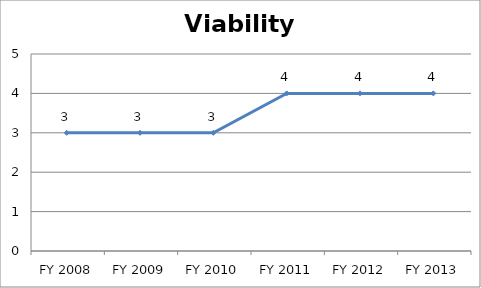
| Category | Viability score |
|---|---|
| FY 2013 | 4 |
| FY 2012 | 4 |
| FY 2011 | 4 |
| FY 2010 | 3 |
| FY 2009 | 3 |
| FY 2008 | 3 |